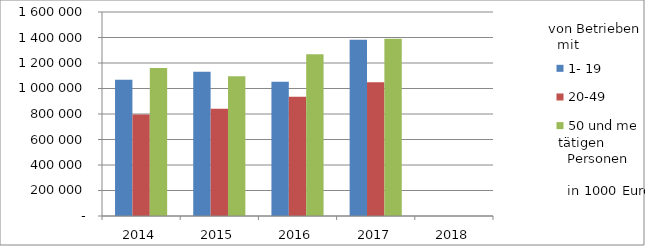
| Category | 1- 19 | 20-49 | 50 und mehr |
|---|---|---|---|
| 2014.0 | 1067719.672 | 796122.546 | 1160478.917 |
| 2015.0 | 1131201.579 | 841056.256 | 1095904.136 |
| 2016.0 | 1053714.338 | 935230.073 | 1268825.798 |
| 2017.0 | 1382676.934 | 1049790.605 | 1390739.609 |
| 2018.0 | 0 | 0 | 0 |